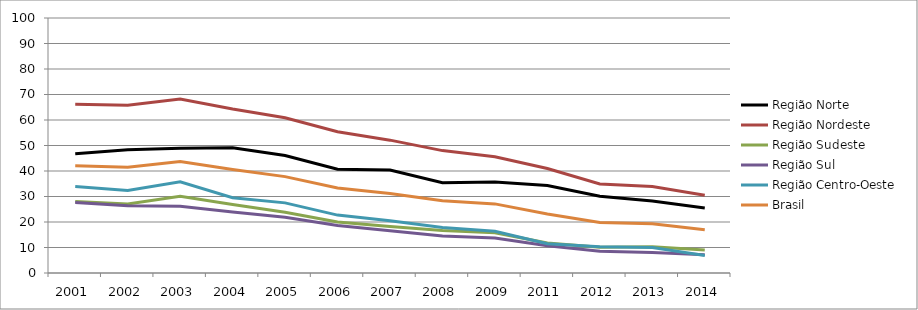
| Category | Região Norte | Região Nordeste | Região Sudeste | Região Sul | Região Centro-Oeste | Brasil |
|---|---|---|---|---|---|---|
| 2001.0 | 46.8 | 66.2 | 28 | 27.6 | 33.9 | 42.1 |
| 2002.0 | 48.3 | 65.8 | 27.1 | 26.4 | 32.4 | 41.5 |
| 2003.0 | 48.9 | 68.2 | 30.1 | 26.2 | 35.8 | 43.7 |
| 2004.0 | 49.1 | 64.3 | 26.9 | 23.9 | 29.5 | 40.6 |
| 2005.0 | 46.1 | 60.9 | 23.8 | 21.9 | 27.5 | 37.8 |
| 2006.0 | 40.7 | 55.4 | 20 | 18.6 | 22.7 | 33.3 |
| 2007.0 | 40.4 | 52.1 | 18.2 | 16.6 | 20.5 | 31.2 |
| 2008.0 | 35.4 | 48 | 16.7 | 14.5 | 17.8 | 28.3 |
| 2009.0 | 35.7 | 45.6 | 15.8 | 13.7 | 16.4 | 27.1 |
| 2011.0 | 34.3 | 41 | 11.8 | 10.7 | 11.5 | 23.1 |
| 2012.0 | 30.1 | 34.9 | 10.1 | 8.5 | 10.3 | 19.8 |
| 2013.0 | 28.2 | 33.9 | 10.3 | 8 | 10 | 19.3 |
| 2014.0 | 25.5 | 30.5 | 9 | 7.2 | 6.9 | 17 |